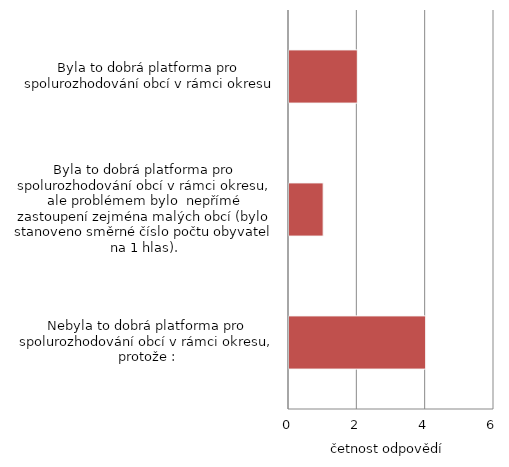
| Category | Počet |
|---|---|
| Nebyla to dobrá platforma pro spolurozhodování obcí v rámci okresu, protože : | 4 |
| Byla to dobrá platforma pro spolurozhodování obcí v rámci okresu, ale problémem bylo  nepřímé zastoupení zejména malých obcí (bylo stanoveno směrné číslo počtu obyvatel na 1 hlas). | 1 |
| Byla to dobrá platforma pro spolurozhodování obcí v rámci okresu | 2 |